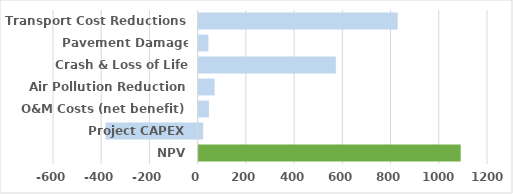
| Category | Series 0 |
|---|---|
| NPV | 1068.039 |
| Project CAPEX | -382.036 |
| O&M Costs (net benefit) | 23.894 |
| Air Pollution Reduction | 47.596 |
| Crash & Loss of Life Reduction | 550.138 |
| Pavement Damage Reduction | 21.658 |
| Transport Cost Reductions | 806.789 |